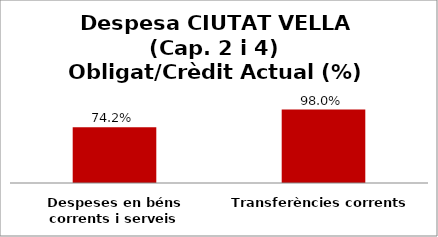
| Category | Series 0 |
|---|---|
| Despeses en béns corrents i serveis | 0.742 |
| Transferències corrents | 0.98 |